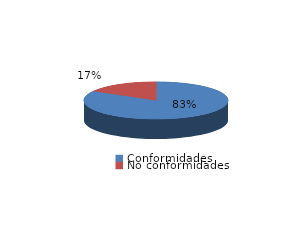
| Category | Series 0 |
|---|---|
| Conformidades | 1559 |
| No conformidades | 312 |